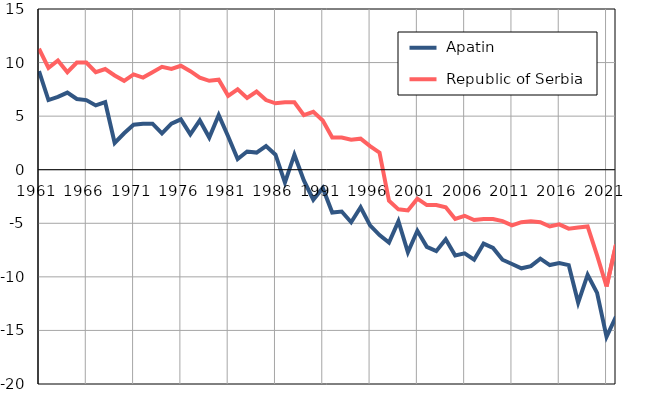
| Category |  Apatin |  Republic of Serbia |
|---|---|---|
| 1961.0 | 9.2 | 11.3 |
| 1962.0 | 6.5 | 9.5 |
| 1963.0 | 6.8 | 10.2 |
| 1964.0 | 7.2 | 9.1 |
| 1965.0 | 6.6 | 10 |
| 1966.0 | 6.5 | 10 |
| 1967.0 | 6 | 9.1 |
| 1968.0 | 6.3 | 9.4 |
| 1969.0 | 2.5 | 8.8 |
| 1970.0 | 3.4 | 8.3 |
| 1971.0 | 4.2 | 8.9 |
| 1972.0 | 4.3 | 8.6 |
| 1973.0 | 4.3 | 9.1 |
| 1974.0 | 3.4 | 9.6 |
| 1975.0 | 4.3 | 9.4 |
| 1976.0 | 4.7 | 9.7 |
| 1977.0 | 3.3 | 9.2 |
| 1978.0 | 4.6 | 8.6 |
| 1979.0 | 3 | 8.3 |
| 1980.0 | 5.1 | 8.4 |
| 1981.0 | 3.1 | 6.9 |
| 1982.0 | 1 | 7.5 |
| 1983.0 | 1.7 | 6.7 |
| 1984.0 | 1.6 | 7.3 |
| 1985.0 | 2.2 | 6.5 |
| 1986.0 | 1.4 | 6.2 |
| 1987.0 | -1.2 | 6.3 |
| 1988.0 | 1.4 | 6.3 |
| 1989.0 | -1 | 5.1 |
| 1990.0 | -2.8 | 5.4 |
| 1991.0 | -1.7 | 4.6 |
| 1992.0 | -4 | 3 |
| 1993.0 | -3.9 | 3 |
| 1994.0 | -4.9 | 2.8 |
| 1995.0 | -3.5 | 2.9 |
| 1996.0 | -5.2 | 2.2 |
| 1997.0 | -6.1 | 1.6 |
| 1998.0 | -6.8 | -2.9 |
| 1999.0 | -4.8 | -3.7 |
| 2000.0 | -7.7 | -3.8 |
| 2001.0 | -5.7 | -2.7 |
| 2002.0 | -7.2 | -3.3 |
| 2003.0 | -7.6 | -3.3 |
| 2004.0 | -6.5 | -3.5 |
| 2005.0 | -8 | -4.6 |
| 2006.0 | -7.8 | -4.3 |
| 2007.0 | -8.4 | -4.7 |
| 2008.0 | -6.9 | -4.6 |
| 2009.0 | -7.3 | -4.6 |
| 2010.0 | -8.4 | -4.8 |
| 2011.0 | -8.8 | -5.2 |
| 2012.0 | -9.2 | -4.9 |
| 2013.0 | -9 | -4.8 |
| 2014.0 | -8.3 | -4.9 |
| 2015.0 | -8.9 | -5.3 |
| 2016.0 | -8.7 | -5.1 |
| 2017.0 | -8.9 | -5.5 |
| 2018.0 | -12.4 | -5.4 |
| 2019.0 | -9.8 | -5.3 |
| 2020.0 | -11.5 | -8 |
| 2021.0 | -15.6 | -10.9 |
| 2022.0 | -13.7 | -7 |